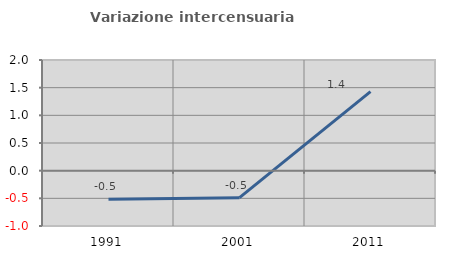
| Category | Variazione intercensuaria annua |
|---|---|
| 1991.0 | -0.516 |
| 2001.0 | -0.488 |
| 2011.0 | 1.429 |